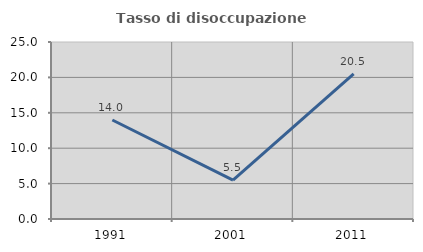
| Category | Tasso di disoccupazione giovanile  |
|---|---|
| 1991.0 | 13.986 |
| 2001.0 | 5.488 |
| 2011.0 | 20.497 |